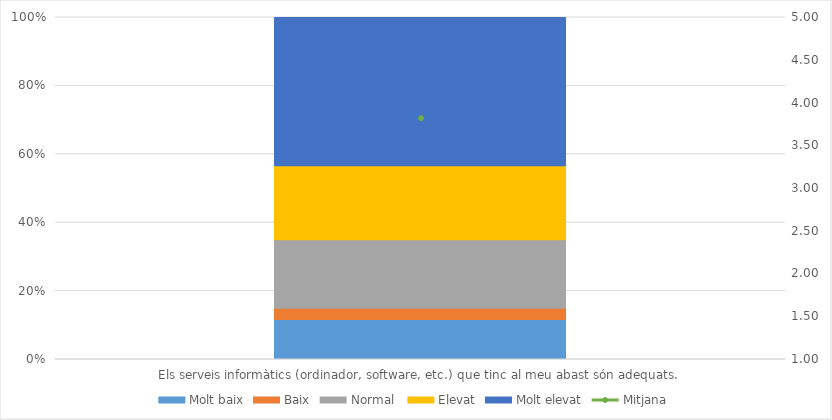
| Category | Molt baix | Baix | Normal  | Elevat | Molt elevat |
|---|---|---|---|---|---|
| Els serveis informàtics (ordinador, software, etc.) que tinc al meu abast són adequats. | 7 | 2 | 12 | 13 | 26 |